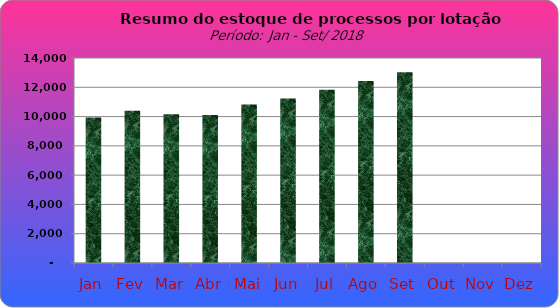
| Category | Series 0 |
|---|---|
| Jan | 9933 |
| Fev | 10393 |
| Mar | 10166 |
| Abr | 10112 |
| Mai | 10819 |
| Jun | 11230 |
| Jul | 11829 |
| Ago | 12430 |
| Set | 13030 |
| Out | 0 |
| Nov | 0 |
| Dez | 0 |